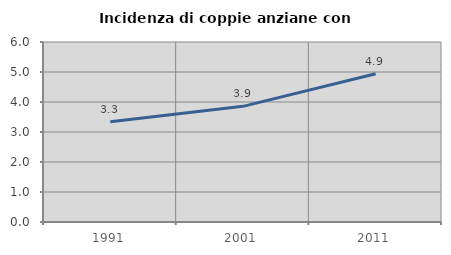
| Category | Incidenza di coppie anziane con figli |
|---|---|
| 1991.0 | 3.341 |
| 2001.0 | 3.855 |
| 2011.0 | 4.941 |